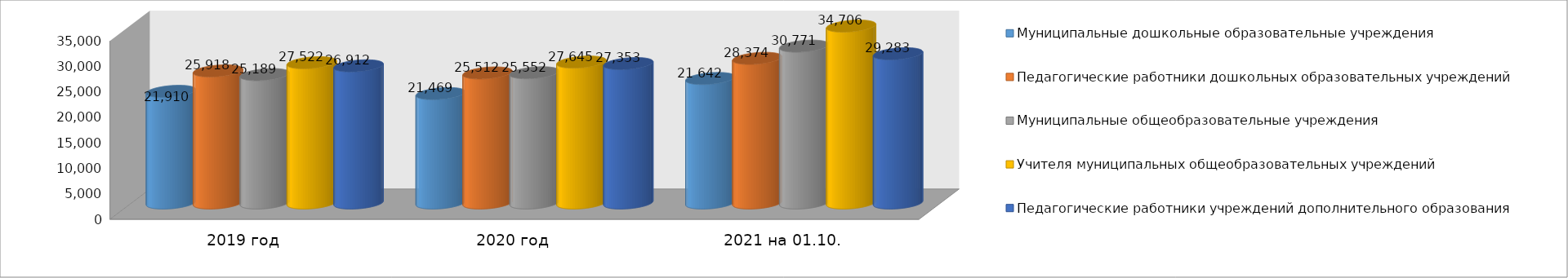
| Category | Муниципальные дошкольные образовательные учреждения | Педагогические работники дошкольных образовательных учреждений | Муниципальные общеобразовательные учреждения | Учителя муниципальных общеобразовательных учреждений | Педагогические работники учреждений дополнительного образования |
|---|---|---|---|---|---|
| 2019 год | 21910 | 25918 | 25189 | 27522 | 26912 |
| 2020 год | 21469 | 25512 | 25552 | 27645 | 27353 |
| 2021 на 01.10. | 24426 | 28374 | 30771 | 34706 | 29283 |